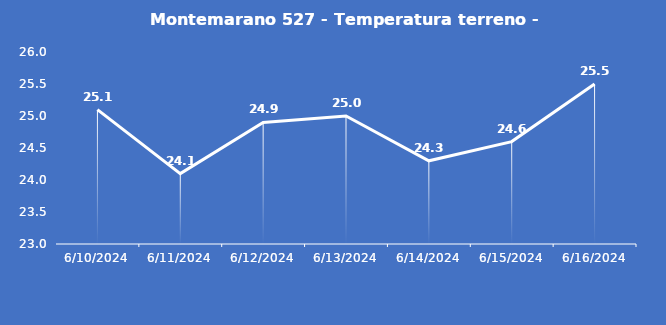
| Category | Montemarano 527 - Temperatura terreno - Grezzo (°C) |
|---|---|
| 6/10/24 | 25.1 |
| 6/11/24 | 24.1 |
| 6/12/24 | 24.9 |
| 6/13/24 | 25 |
| 6/14/24 | 24.3 |
| 6/15/24 | 24.6 |
| 6/16/24 | 25.5 |